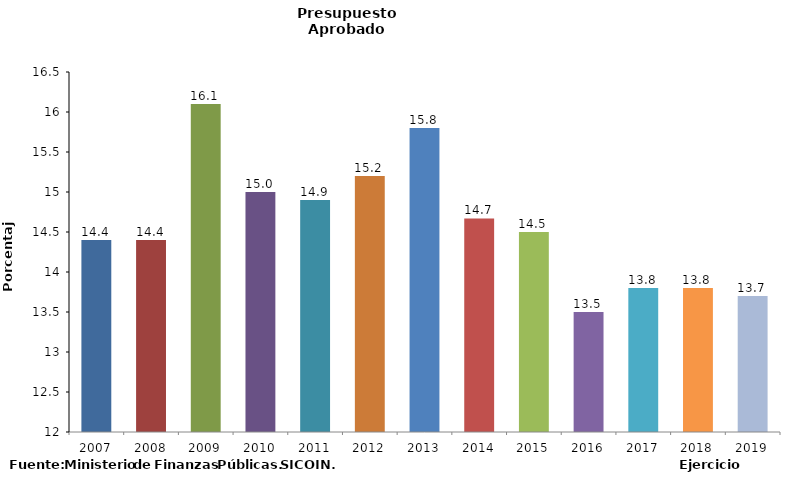
| Category | Series 0 |
|---|---|
| 2007 | 14.4 |
| 2008 | 14.4 |
| 2009 | 16.1 |
| 2010 | 15 |
| 2011 | 14.9 |
| 2012 | 15.2 |
| 2013 | 15.8 |
| 2014 | 14.67 |
| 2015 | 14.5 |
| 2016 | 13.5 |
| 2017 | 13.8 |
| 2018 | 13.8 |
| 2019 | 13.7 |